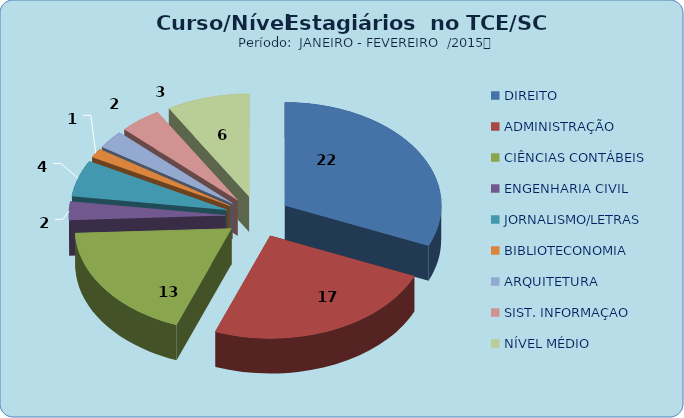
| Category | Series 0 |
|---|---|
| DIREITO | 22 |
| ADMINISTRAÇÃO | 17 |
| CIÊNCIAS CONTÁBEIS | 13 |
| ENGENHARIA CIVIL | 2 |
| JORNALISMO/LETRAS | 4 |
| BIBLIOTECONOMIA | 1 |
| ARQUITETURA | 2 |
| SIST. INFORMAÇAO | 3 |
| NÍVEL MÉDIO | 6 |